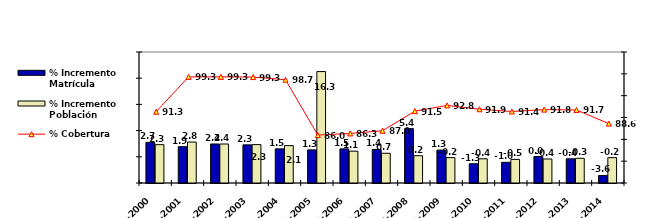
| Category | % Incremento Matrícula | % Incremento Población |
|---|---|---|
| 2005-2006 | 1.512 | 1.07 |
| 2006-2007 | 1.401 | 0.673 |
| 2007-2008 | 5.374 | 0.205 |
| 2008-2009 | 1.277 | -0.152 |
| 2009-2010 | -1.325 | -0.381 |
| 2010-2011 | -1.049 | -0.496 |
| 2011-2012 | 0.05 | -0.418 |
| 2012-2013 | -0.38 | -0.287 |
| 2013-2014 | -3.561 | -0.162 |